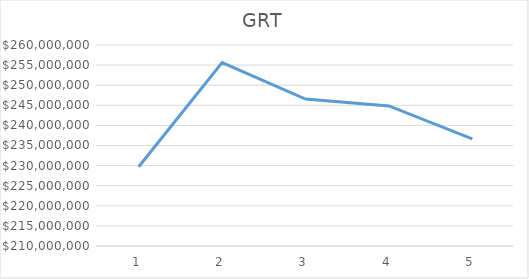
| Category | Series 0 |
|---|---|
| 0 | 229701974.03 |
| 1 | 255611364.15 |
| 2 | 246559667.45 |
| 3 | 244851701.84 |
| 4 | 236643496.92 |